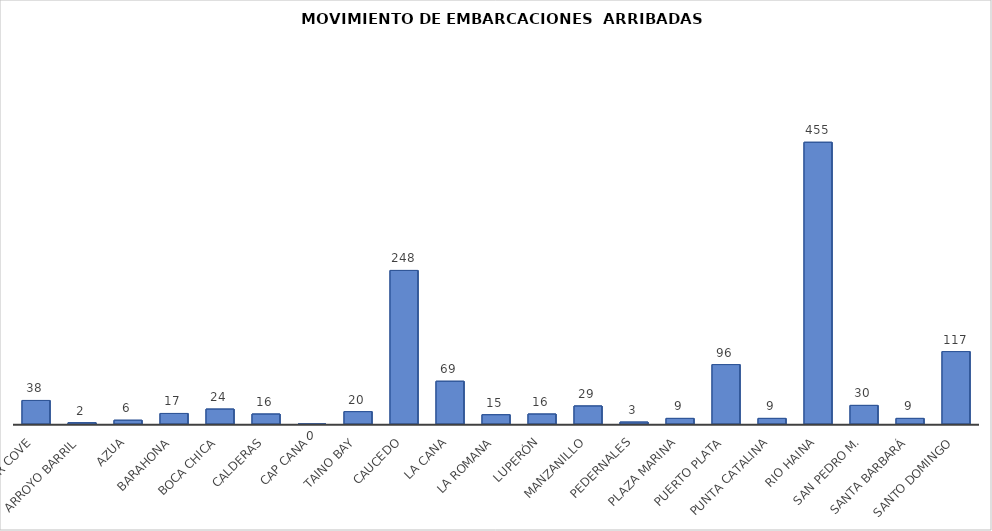
| Category | Series 0 |
|---|---|
| Amber Cove | 38 |
| Arroyo Barril | 2 |
| Azua | 6 |
| Barahona | 17 |
| Boca Chica | 24 |
| Calderas | 16 |
| Cap Cana | 0 |
| Taino Bay | 20 |
| Caucedo | 248 |
| La Cana | 69 |
| La Romana | 15 |
| Luperón | 16 |
| Manzanillo | 29 |
| Pedernales | 3 |
| Plaza Marina | 9 |
| Puerto Plata | 96 |
| Punta Catalina | 9 |
| Rio Haina | 455 |
| San Pedro M. | 30 |
| Santa Barbará | 9 |
| Santo Domingo | 117 |